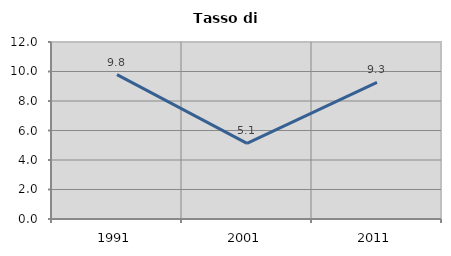
| Category | Tasso di disoccupazione   |
|---|---|
| 1991.0 | 9.792 |
| 2001.0 | 5.128 |
| 2011.0 | 9.264 |